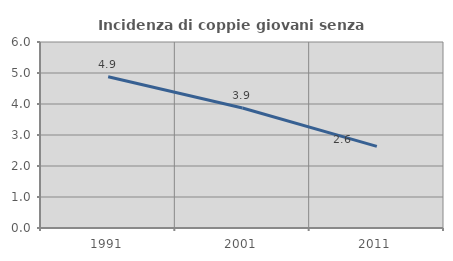
| Category | Incidenza di coppie giovani senza figli |
|---|---|
| 1991.0 | 4.882 |
| 2001.0 | 3.872 |
| 2011.0 | 2.633 |